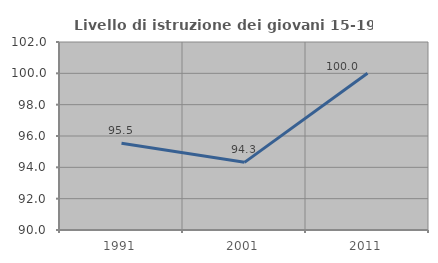
| Category | Livello di istruzione dei giovani 15-19 anni |
|---|---|
| 1991.0 | 95.536 |
| 2001.0 | 94.318 |
| 2011.0 | 100 |